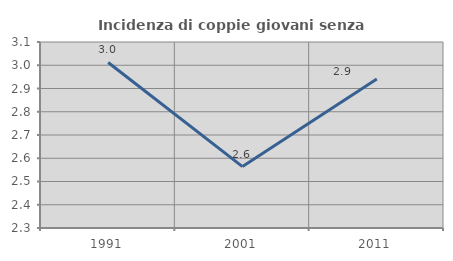
| Category | Incidenza di coppie giovani senza figli |
|---|---|
| 1991.0 | 3.012 |
| 2001.0 | 2.564 |
| 2011.0 | 2.941 |